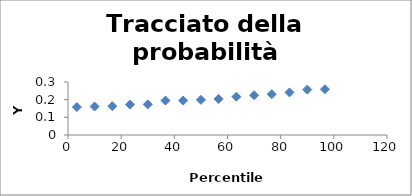
| Category | Series 0 |
|---|---|
| 3.3333333333333335 | 0.158 |
| 10.0 | 0.161 |
| 16.666666666666668 | 0.163 |
| 23.333333333333332 | 0.172 |
| 30.0 | 0.173 |
| 36.66666666666667 | 0.195 |
| 43.333333333333336 | 0.195 |
| 50.00000000000001 | 0.199 |
| 56.66666666666667 | 0.204 |
| 63.333333333333336 | 0.217 |
| 70.0 | 0.225 |
| 76.66666666666667 | 0.231 |
| 83.33333333333333 | 0.241 |
| 90.0 | 0.257 |
| 96.66666666666667 | 0.259 |